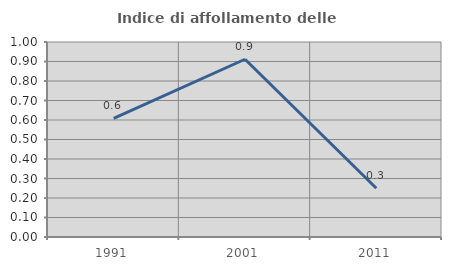
| Category | Indice di affollamento delle abitazioni  |
|---|---|
| 1991.0 | 0.608 |
| 2001.0 | 0.912 |
| 2011.0 | 0.25 |